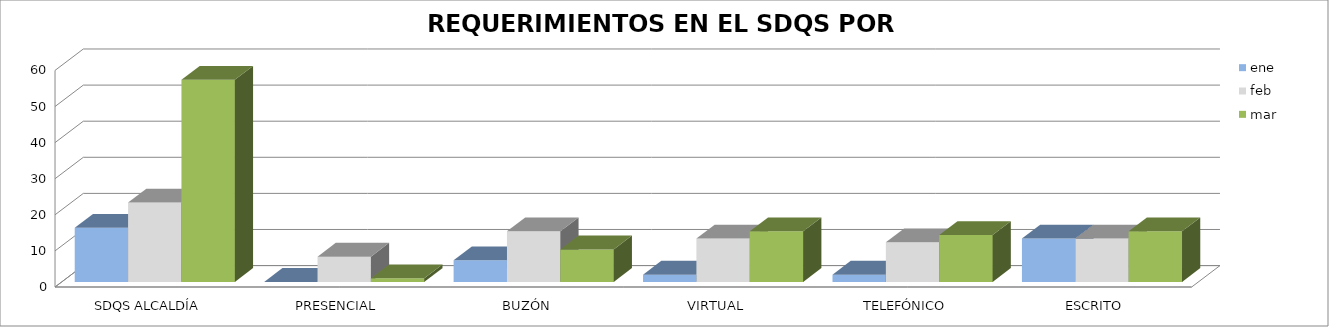
| Category | ene | feb | mar |
|---|---|---|---|
| SDQS ALCALDÍA | 15 | 22 | 56 |
| PRESENCIAL | 0 | 7 | 1 |
| BUZÓN | 6 | 14 | 9 |
| VIRTUAL | 2 | 12 | 14 |
| TELEFÓNICO | 2 | 11 | 13 |
| ESCRITO | 12 | 12 | 14 |